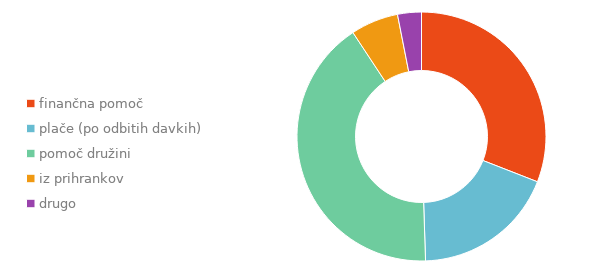
| Category | Series 0 |
|---|---|
| finančna pomoč | 0.309 |
| plače (po odbitih davkih) | 0.186 |
| pomoč družini | 0.412 |
| iz prihrankov | 0.062 |
| drugo | 0.031 |